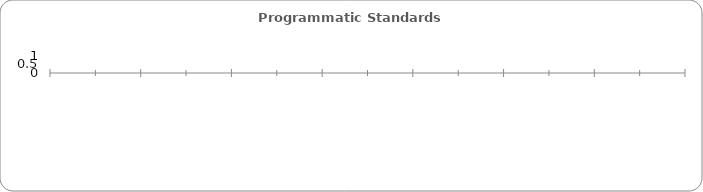
| Category | Series 0 | Series 1 | Series 2 | Series 3 |
|---|---|---|---|---|
| Standard 1: Clear Vision, Mission, Purpose, and Management |  |  |  | 0 |
| Standard 2: Continuous Quality Improvement |  |  |  | 0 |
| Standard 3: Quality Staff |  |  |  | 0 |
| Standard 4: Collaborative Partnerships |  |  |  | 0 |
| Standard 5: Family Engagement |  |  |  | 0 |
| Standard 6: Sustainability |  |  |  | 0 |
| All Programmatic Standards Average |  |  |  | 0 |